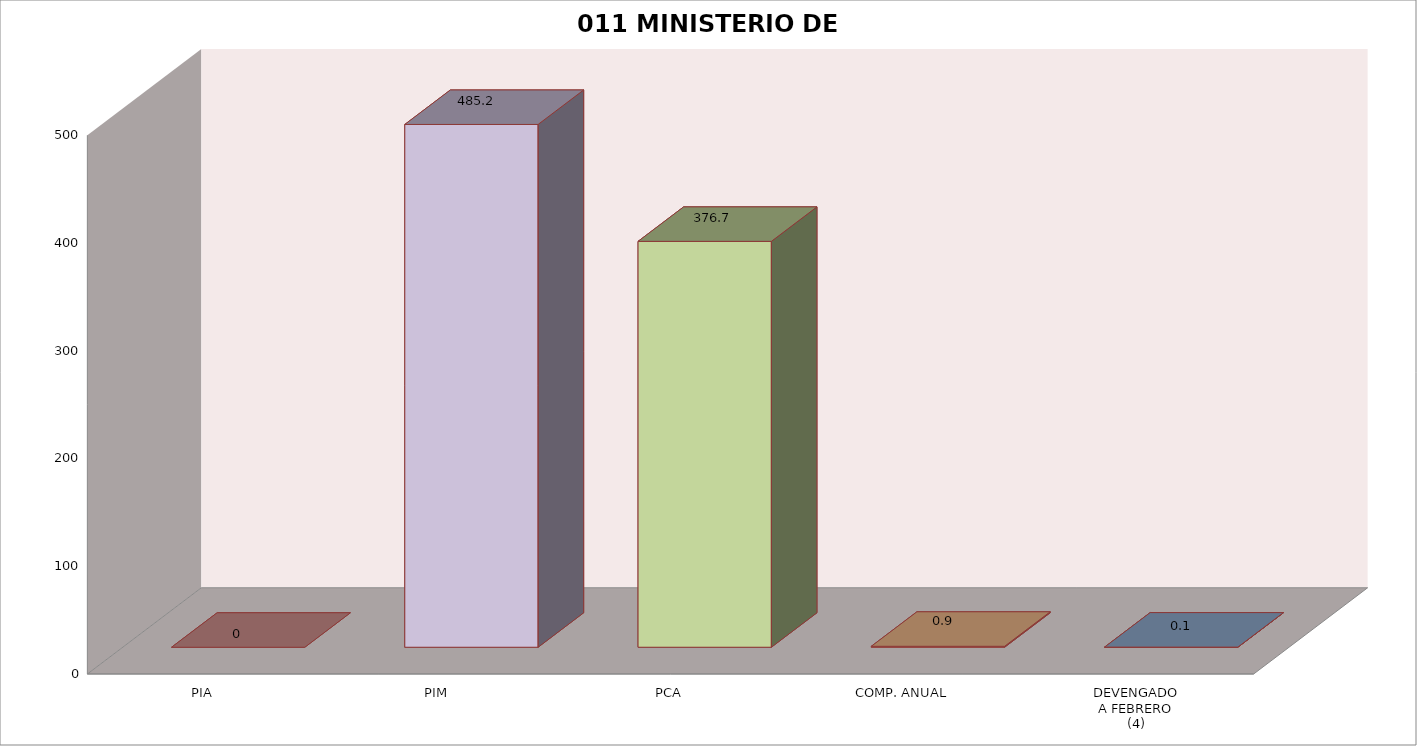
| Category | 011 MINISTERIO DE SALUD |
|---|---|
| PIA | 0 |
| PIM | 485.191 |
| PCA | 376.688 |
| COMP. ANUAL | 0.896 |
| DEVENGADO
A FEBRERO
(4) | 0.14 |